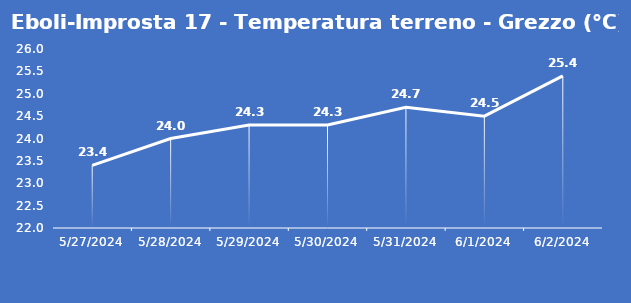
| Category | Eboli-Improsta 17 - Temperatura terreno - Grezzo (°C) |
|---|---|
| 5/27/24 | 23.4 |
| 5/28/24 | 24 |
| 5/29/24 | 24.3 |
| 5/30/24 | 24.3 |
| 5/31/24 | 24.7 |
| 6/1/24 | 24.5 |
| 6/2/24 | 25.4 |